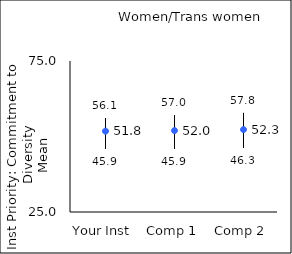
| Category | 25th percentile | 75th percentile | Mean |
|---|---|---|---|
| Your Inst | 45.9 | 56.1 | 51.77 |
| Comp 1 | 45.9 | 57 | 51.95 |
| Comp 2 | 46.3 | 57.8 | 52.29 |